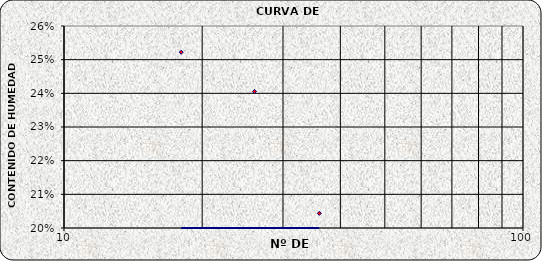
| Category | Series 0 |
|---|---|
| 36.0 | 0.204 |
| 26.0 | 0.241 |
| 18.0 | 0.252 |